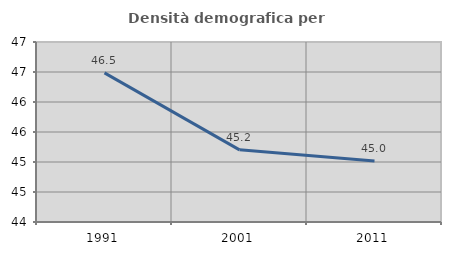
| Category | Densità demografica |
|---|---|
| 1991.0 | 46.486 |
| 2001.0 | 45.203 |
| 2011.0 | 45.017 |